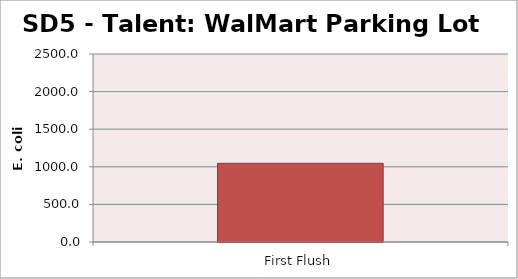
| Category | E. coli MPN |
|---|---|
| First Flush | 1046.2 |